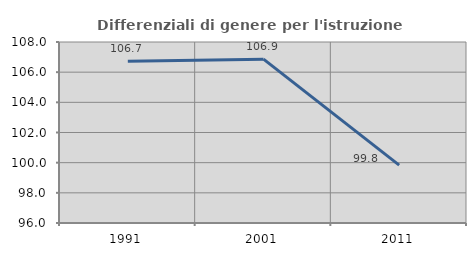
| Category | Differenziali di genere per l'istruzione superiore |
|---|---|
| 1991.0 | 106.719 |
| 2001.0 | 106.861 |
| 2011.0 | 99.838 |